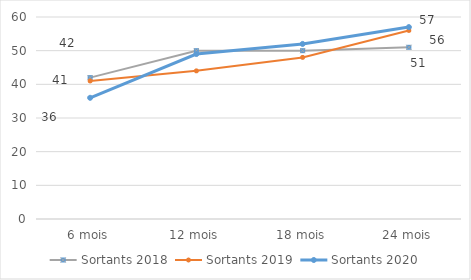
| Category | Sortants 2018 | Sortants 2019 | Sortants 2020 |
|---|---|---|---|
| 6 mois | 42 | 41 | 36 |
| 12 mois | 50 | 44 | 49 |
| 18 mois | 50 | 48 | 52 |
| 24 mois | 51 | 56 | 57 |